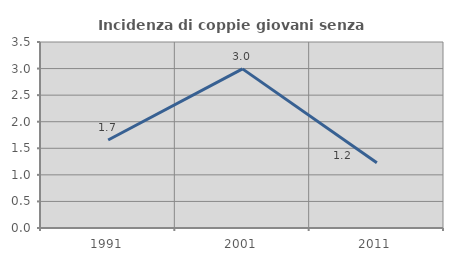
| Category | Incidenza di coppie giovani senza figli |
|---|---|
| 1991.0 | 1.656 |
| 2001.0 | 2.994 |
| 2011.0 | 1.227 |